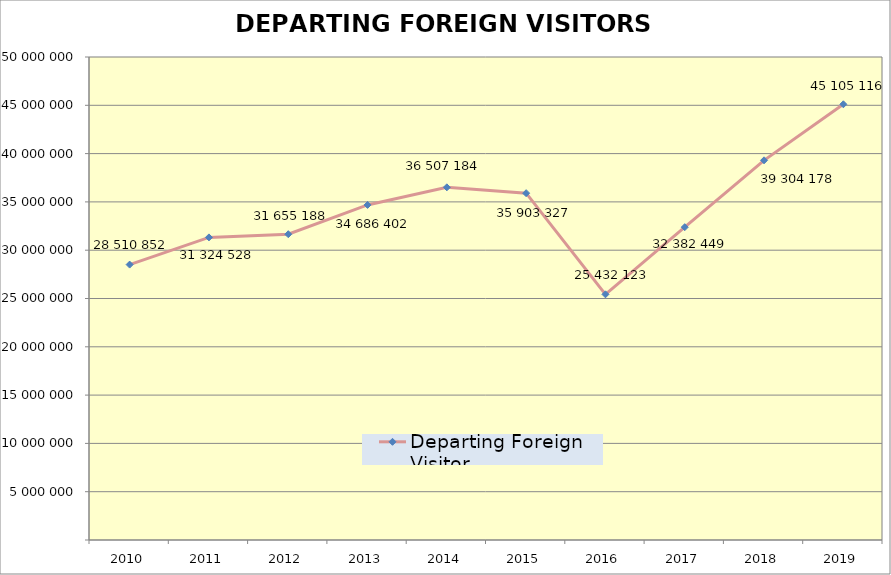
| Category | Departing Foreign Visitor |
|---|---|
| 2010.0 | 28510852 |
| 2011.0 | 31324528 |
| 2012.0 | 31655188 |
| 2013.0 | 34686402 |
| 2014.0 | 36507184 |
| 2015.0 | 35903327 |
| 2016.0 | 25432123 |
| 2017.0 | 32382449 |
| 2018.0 | 39304178 |
| 2019.0 | 45105116 |